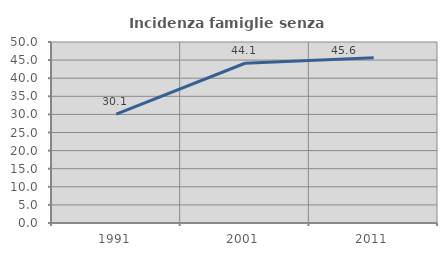
| Category | Incidenza famiglie senza nuclei |
|---|---|
| 1991.0 | 30.075 |
| 2001.0 | 44.132 |
| 2011.0 | 45.65 |